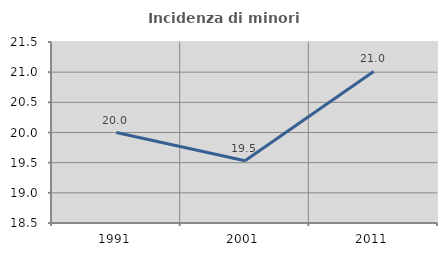
| Category | Incidenza di minori stranieri |
|---|---|
| 1991.0 | 20 |
| 2001.0 | 19.531 |
| 2011.0 | 21.012 |